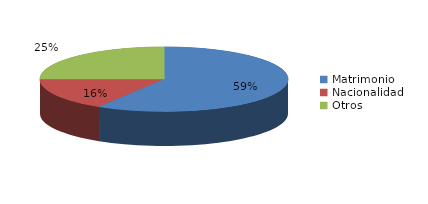
| Category | Series 0 |
|---|---|
| Matrimonio | 806 |
| Nacionalidad | 223 |
| Otros | 343 |